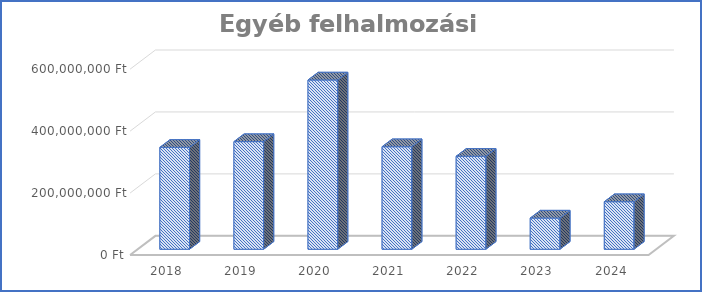
| Category | Egyéb felhalmozási kiadások |
|---|---|
| 2018.0 | 329000000 |
| 2019.0 | 347532723 |
| 2020.0 | 546532801 |
| 2021.0 | 331057850 |
| 2022.0 | 300231670 |
| 2023.0 | 100712499 |
| 2024.0 | 153490520 |